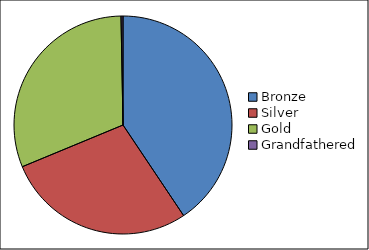
| Category | Series 0 |
|---|---|
| Bronze | 13321 |
| Silver | 9227 |
| Gold | 10154 |
| Grandfathered | 96 |